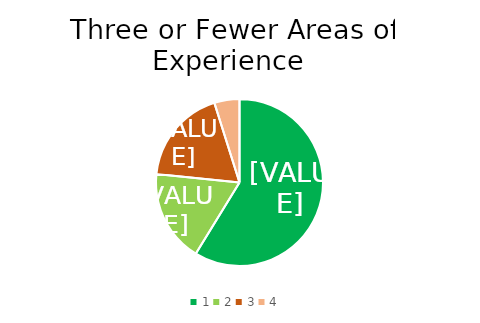
| Category | Series 0 |
|---|---|
| 0 | 0.588 |
| 1 | 0.179 |
| 2 | 0.185 |
| 3 | 0.049 |